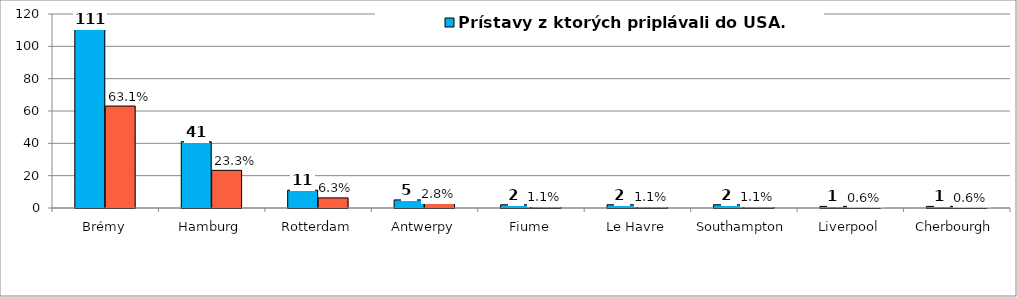
| Category | Prístavy z ktorých priplávali do USA. | Series 1 |
|---|---|---|
| Brémy | 111 | 63.068 |
| Hamburg | 41 | 23.295 |
| Rotterdam | 11 | 6.25 |
| Antwerpy | 5 | 2.841 |
| Fiume | 2 | 1.136 |
| Le Havre | 2 | 1.136 |
| Southampton | 2 | 1.136 |
| Liverpool | 1 | 0.568 |
| Cherbourgh | 1 | 0.568 |